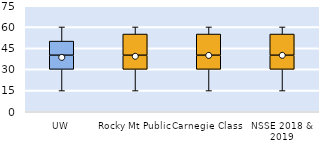
| Category | 25th | 50th | 75th |
|---|---|---|---|
| UW | 30 | 10 | 10 |
| Rocky Mt Public | 30 | 10 | 15 |
| Carnegie Class | 30 | 10 | 15 |
| NSSE 2018 & 2019 | 30 | 10 | 15 |